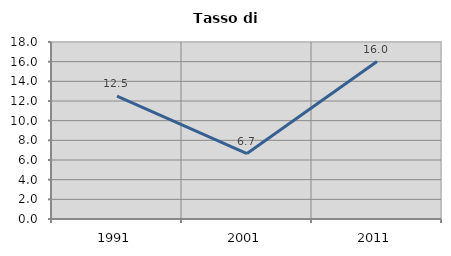
| Category | Tasso di disoccupazione   |
|---|---|
| 1991.0 | 12.5 |
| 2001.0 | 6.657 |
| 2011.0 | 16.015 |